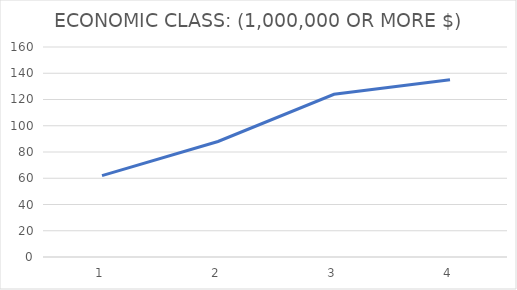
| Category | ECONOMIC CLASS: (1,000,000 OR MORE $) |
|---|---|
| 0 | 62 |
| 1 | 88 |
| 2 | 124 |
| 3 | 135 |